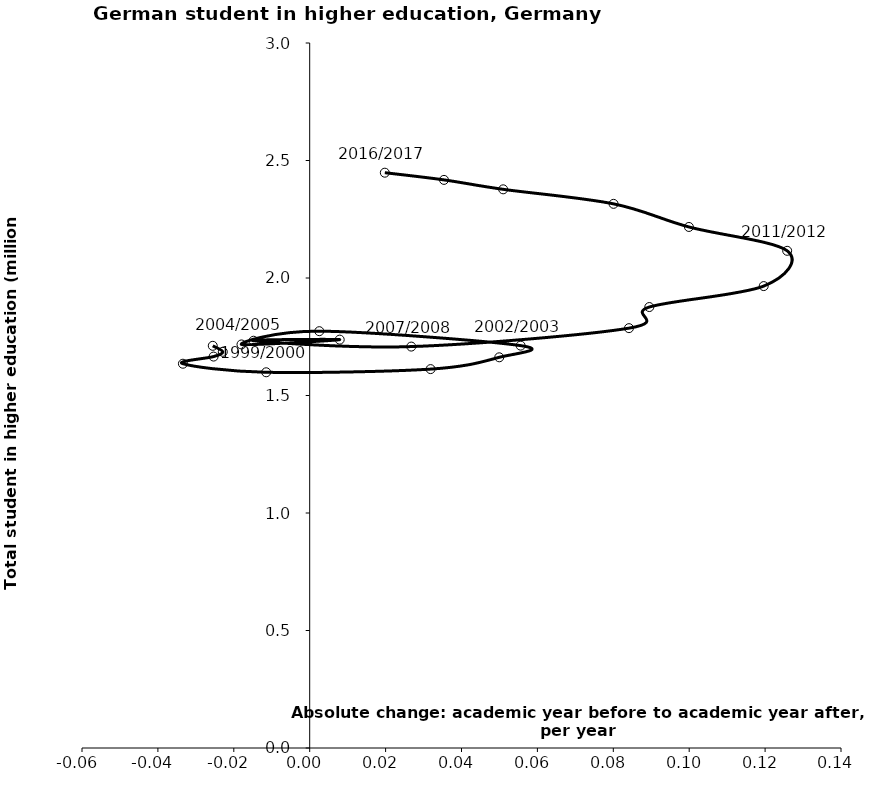
| Category | Series 0 |
|---|---|
| -0.025540999999999814 | 1.711 |
| -0.02290049999999988 | 1.686 |
| -0.02532699999999999 | 1.666 |
| -0.03340850000000006 | 1.635 |
| -0.01146400000000014 | 1.599 |
| 0.03185450000000001 | 1.612 |
| 0.0499480000000001 | 1.663 |
| 0.055584999999999996 | 1.712 |
| 0.0025284999999999336 | 1.774 |
| -0.017973000000000017 | 1.717 |
| 0.00790600000000008 | 1.738 |
| -0.014796000000000031 | 1.733 |
| 0.026761499999999883 | 1.708 |
| 0.08412850000000005 | 1.787 |
| 0.08948650000000002 | 1.876 |
| 0.1196339999999998 | 1.966 |
| 0.1258180000000002 | 2.116 |
| 0.0999245000000002 | 2.217 |
| 0.08006649999999982 | 2.316 |
| 0.05098150000000001 | 2.377 |
| 0.035386999999999835 | 2.417 |
| 0.019792499999999658 | 2.448 |